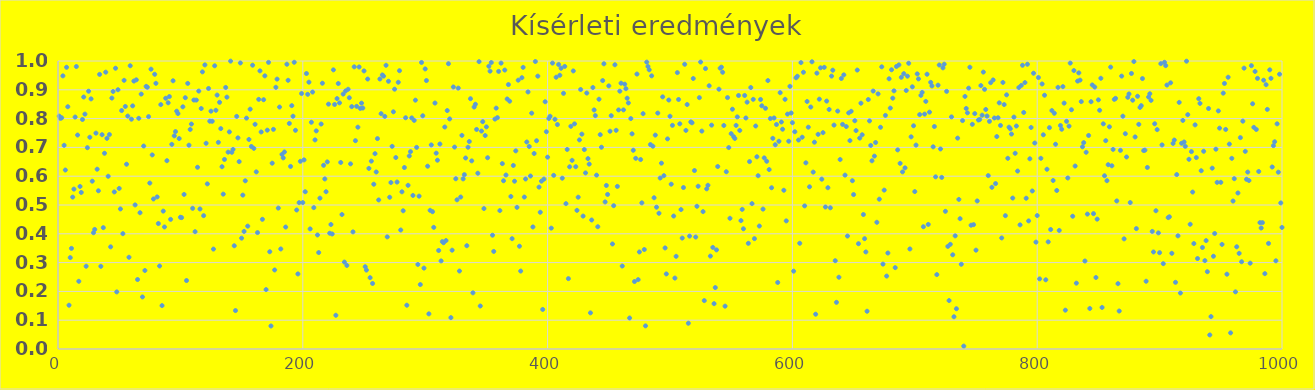
| Category | Series 0 |
|---|---|
| 1.0 | 0.809 |
| 2.0 | 0.801 |
| 3.0 | 0.803 |
| 4.0 | 0.948 |
| 5.0 | 0.707 |
| 6.0 | 0.621 |
| 7.0 | 0.978 |
| 8.0 | 0.841 |
| 9.0 | 0.152 |
| 10.0 | 0.317 |
| 11.0 | 0.349 |
| 12.0 | 0.527 |
| 13.0 | 0.555 |
| 14.0 | 0.805 |
| 15.0 | 0.981 |
| 16.0 | 0.743 |
| 17.0 | 0.235 |
| 18.0 | 0.564 |
| 19.0 | 0.544 |
| 20.0 | 0.797 |
| 21.0 | 0.875 |
| 22.0 | 0.816 |
| 23.0 | 0.287 |
| 24.0 | 0.699 |
| 25.0 | 0.895 |
| 26.0 | 0.735 |
| 27.0 | 0.869 |
| 28.0 | 0.583 |
| 29.0 | 0.404 |
| 30.0 | 0.415 |
| 31.0 | 0.75 |
| 32.0 | 0.624 |
| 33.0 | 0.549 |
| 34.0 | 0.954 |
| 35.0 | 0.287 |
| 36.0 | 0.744 |
| 37.0 | 0.421 |
| 38.0 | 0.68 |
| 39.0 | 0.961 |
| 40.0 | 0.731 |
| 41.0 | 0.6 |
| 42.0 | 0.745 |
| 43.0 | 0.355 |
| 44.0 | 0.871 |
| 45.0 | 0.894 |
| 46.0 | 0.545 |
| 47.0 | 0.975 |
| 48.0 | 0.198 |
| 49.0 | 0.9 |
| 50.0 | 0.558 |
| 51.0 | 0.486 |
| 52.0 | 0.828 |
| 53.0 | 0.4 |
| 54.0 | 0.933 |
| 55.0 | 0.842 |
| 56.0 | 0.642 |
| 57.0 | 0.809 |
| 58.0 | 0.318 |
| 59.0 | 0.983 |
| 60.0 | 0.798 |
| 61.0 | 0.844 |
| 62.0 | 0.93 |
| 63.0 | 0.5 |
| 64.0 | 0.935 |
| 65.0 | 0.241 |
| 66.0 | 0.801 |
| 67.0 | 0.473 |
| 68.0 | 0.885 |
| 69.0 | 0.181 |
| 70.0 | 0.705 |
| 71.0 | 0.273 |
| 72.0 | 0.912 |
| 73.0 | 0.909 |
| 74.0 | 0.807 |
| 75.0 | 0.576 |
| 76.0 | 0.972 |
| 77.0 | 0.674 |
| 78.0 | 0.521 |
| 79.0 | 0.954 |
| 80.0 | 0.923 |
| 81.0 | 0.528 |
| 82.0 | 0.436 |
| 83.0 | 0.288 |
| 84.0 | 0.849 |
| 85.0 | 0.151 |
| 86.0 | 0.479 |
| 87.0 | 0.424 |
| 88.0 | 0.871 |
| 89.0 | 0.654 |
| 90.0 | 0.855 |
| 91.0 | 0.876 |
| 92.0 | 0.45 |
| 93.0 | 0.711 |
| 94.0 | 0.931 |
| 95.0 | 0.74 |
| 96.0 | 0.755 |
| 97.0 | 0.826 |
| 98.0 | 0.817 |
| 99.0 | 0.731 |
| 100.0 | 0.457 |
| 101.0 | 0.456 |
| 102.0 | 0.841 |
| 103.0 | 0.537 |
| 104.0 | 0.873 |
| 105.0 | 0.238 |
| 106.0 | 0.922 |
| 107.0 | 0.708 |
| 108.0 | 0.762 |
| 109.0 | 0.781 |
| 110.0 | 0.488 |
| 111.0 | 0.864 |
| 112.0 | 0.407 |
| 113.0 | 0.864 |
| 114.0 | 0.631 |
| 115.0 | 0.896 |
| 116.0 | 0.486 |
| 117.0 | 0.835 |
| 118.0 | 0.962 |
| 119.0 | 0.463 |
| 120.0 | 0.986 |
| 121.0 | 0.714 |
| 122.0 | 0.573 |
| 123.0 | 0.905 |
| 124.0 | 0.791 |
| 125.0 | 0.826 |
| 126.0 | 0.791 |
| 127.0 | 0.347 |
| 128.0 | 0.983 |
| 129.0 | 0.829 |
| 130.0 | 0.882 |
| 131.0 | 0.718 |
| 132.0 | 0.857 |
| 133.0 | 0.765 |
| 134.0 | 0.633 |
| 135.0 | 0.538 |
| 136.0 | 0.658 |
| 137.0 | 0.908 |
| 138.0 | 0.874 |
| 139.0 | 0.684 |
| 140.0 | 0.754 |
| 141.0 | 1 |
| 142.0 | 0.683 |
| 143.0 | 0.693 |
| 144.0 | 0.358 |
| 145.0 | 0.133 |
| 146.0 | 0.808 |
| 147.0 | 0.733 |
| 148.0 | 0.651 |
| 149.0 | 0.993 |
| 150.0 | 0.385 |
| 151.0 | 0.534 |
| 152.0 | 0.408 |
| 153.0 | 0.584 |
| 154.0 | 0.802 |
| 155.0 | 0.427 |
| 156.0 | 0.728 |
| 157.0 | 0.833 |
| 158.0 | 0.703 |
| 159.0 | 0.985 |
| 160.0 | 0.697 |
| 161.0 | 0.78 |
| 162.0 | 0.615 |
| 163.0 | 0.404 |
| 164.0 | 0.867 |
| 165.0 | 0.966 |
| 166.0 | 0.754 |
| 167.0 | 0.45 |
| 168.0 | 0.866 |
| 169.0 | 0.948 |
| 170.0 | 0.206 |
| 171.0 | 0.76 |
| 172.0 | 0.995 |
| 173.0 | 0.338 |
| 174.0 | 0.08 |
| 175.0 | 0.645 |
| 176.0 | 0.763 |
| 177.0 | 0.274 |
| 178.0 | 0.909 |
| 179.0 | 0.937 |
| 180.0 | 0.489 |
| 181.0 | 0.84 |
| 182.0 | 0.347 |
| 183.0 | 0.676 |
| 184.0 | 0.664 |
| 185.0 | 0.684 |
| 186.0 | 0.423 |
| 187.0 | 0.989 |
| 188.0 | 0.933 |
| 189.0 | 0.783 |
| 190.0 | 0.634 |
| 191.0 | 0.845 |
| 192.0 | 0.808 |
| 193.0 | 0.996 |
| 194.0 | 0.759 |
| 195.0 | 0.483 |
| 196.0 | 0.261 |
| 197.0 | 0.508 |
| 198.0 | 0.652 |
| 199.0 | 0.887 |
| 200.0 | 0.508 |
| 201.0 | 0.657 |
| 202.0 | 0.546 |
| 203.0 | 0.956 |
| 204.0 | 0.884 |
| 205.0 | 0.926 |
| 206.0 | 0.417 |
| 207.0 | 0.787 |
| 208.0 | 0.892 |
| 209.0 | 0.491 |
| 210.0 | 0.726 |
| 211.0 | 0.757 |
| 212.0 | 0.396 |
| 213.0 | 0.335 |
| 214.0 | 0.524 |
| 215.0 | 0.781 |
| 216.0 | 0.923 |
| 217.0 | 0.638 |
| 218.0 | 0.59 |
| 219.0 | 0.546 |
| 220.0 | 0.65 |
| 221.0 | 0.85 |
| 222.0 | 0.402 |
| 223.0 | 0.432 |
| 224.0 | 0.399 |
| 225.0 | 0.969 |
| 226.0 | 0.849 |
| 227.0 | 0.117 |
| 228.0 | 0.87 |
| 229.0 | 0.922 |
| 230.0 | 0.855 |
| 231.0 | 0.648 |
| 232.0 | 0.467 |
| 233.0 | 0.885 |
| 234.0 | 0.302 |
| 235.0 | 0.896 |
| 236.0 | 0.29 |
| 237.0 | 0.902 |
| 238.0 | 0.872 |
| 239.0 | 0.643 |
| 240.0 | 0.842 |
| 241.0 | 0.407 |
| 242.0 | 0.98 |
| 243.0 | 0.723 |
| 244.0 | 0.843 |
| 245.0 | 0.77 |
| 246.0 | 0.979 |
| 247.0 | 0.835 |
| 248.0 | 0.854 |
| 249.0 | 0.837 |
| 250.0 | 0.966 |
| 251.0 | 0.286 |
| 252.0 | 0.274 |
| 253.0 | 0.937 |
| 254.0 | 0.627 |
| 255.0 | 0.248 |
| 256.0 | 0.652 |
| 257.0 | 0.228 |
| 258.0 | 0.572 |
| 259.0 | 0.678 |
| 260.0 | 0.615 |
| 261.0 | 0.731 |
| 262.0 | 0.518 |
| 263.0 | 0.938 |
| 264.0 | 0.817 |
| 265.0 | 0.952 |
| 266.0 | 0.948 |
| 267.0 | 0.808 |
| 268.0 | 0.985 |
| 269.0 | 0.389 |
| 270.0 | 0.93 |
| 271.0 | 0.527 |
| 272.0 | 0.578 |
| 273.0 | 0.704 |
| 274.0 | 0.824 |
| 275.0 | 0.902 |
| 276.0 | 0.665 |
| 277.0 | 0.58 |
| 278.0 | 0.926 |
| 279.0 | 0.966 |
| 280.0 | 0.413 |
| 281.0 | 0.546 |
| 282.0 | 0.48 |
| 283.0 | 0.63 |
| 284.0 | 0.803 |
| 285.0 | 0.152 |
| 286.0 | 0.568 |
| 287.0 | 0.67 |
| 288.0 | 0.685 |
| 289.0 | 0.802 |
| 290.0 | 0.533 |
| 291.0 | 0.794 |
| 292.0 | 0.864 |
| 293.0 | 0.7 |
| 294.0 | 0.294 |
| 295.0 | 0.531 |
| 296.0 | 0.224 |
| 297.0 | 0.995 |
| 298.0 | 0.81 |
| 299.0 | 0.281 |
| 300.0 | 0.973 |
| 301.0 | 0.932 |
| 302.0 | 0.635 |
| 303.0 | 0.122 |
| 304.0 | 0.482 |
| 305.0 | 0.709 |
| 306.0 | 0.477 |
| 307.0 | 0.422 |
| 308.0 | 0.854 |
| 309.0 | 0.68 |
| 310.0 | 0.656 |
| 311.0 | 0.342 |
| 312.0 | 0.712 |
| 313.0 | 0.306 |
| 314.0 | 0.373 |
| 315.0 | 0.369 |
| 316.0 | 0.771 |
| 317.0 | 0.377 |
| 318.0 | 0.828 |
| 319.0 | 0.991 |
| 320.0 | 0.799 |
| 321.0 | 0.109 |
| 322.0 | 0.343 |
| 323.0 | 0.91 |
| 324.0 | 0.701 |
| 325.0 | 0.591 |
| 326.0 | 0.518 |
| 327.0 | 0.906 |
| 328.0 | 0.271 |
| 329.0 | 0.528 |
| 330.0 | 0.742 |
| 331.0 | 0.591 |
| 332.0 | 0.605 |
| 333.0 | 0.663 |
| 334.0 | 0.359 |
| 335.0 | 0.701 |
| 336.0 | 0.72 |
| 337.0 | 0.869 |
| 338.0 | 0.653 |
| 339.0 | 0.195 |
| 340.0 | 0.84 |
| 341.0 | 0.85 |
| 342.0 | 0.762 |
| 343.0 | 0.61 |
| 344.0 | 0.998 |
| 345.0 | 0.149 |
| 346.0 | 0.757 |
| 347.0 | 0.789 |
| 348.0 | 0.488 |
| 349.0 | 0.741 |
| 350.0 | 0.771 |
| 351.0 | 0.664 |
| 352.0 | 0.982 |
| 353.0 | 0.965 |
| 354.0 | 0.995 |
| 355.0 | 0.395 |
| 356.0 | 0.339 |
| 357.0 | 0.798 |
| 358.0 | 0.836 |
| 359.0 | 0.803 |
| 360.0 | 0.964 |
| 361.0 | 0.481 |
| 362.0 | 0.993 |
| 363.0 | 0.644 |
| 364.0 | 0.584 |
| 365.0 | 0.969 |
| 366.0 | 0.604 |
| 367.0 | 0.868 |
| 368.0 | 0.918 |
| 369.0 | 0.86 |
| 370.0 | 0.53 |
| 371.0 | 0.383 |
| 372.0 | 0.637 |
| 373.0 | 0.583 |
| 374.0 | 0.688 |
| 375.0 | 0.492 |
| 376.0 | 0.933 |
| 377.0 | 0.357 |
| 378.0 | 0.271 |
| 379.0 | 0.942 |
| 380.0 | 0.978 |
| 381.0 | 0.528 |
| 382.0 | 0.59 |
| 383.0 | 0.719 |
| 384.0 | 0.893 |
| 385.0 | 0.703 |
| 386.0 | 0.601 |
| 387.0 | 0.819 |
| 388.0 | 0.424 |
| 389.0 | 0.679 |
| 390.0 | 0.998 |
| 391.0 | 0.723 |
| 392.0 | 0.947 |
| 393.0 | 0.562 |
| 394.0 | 0.475 |
| 395.0 | 0.583 |
| 396.0 | 0.137 |
| 397.0 | 0.59 |
| 398.0 | 0.859 |
| 399.0 | 0.754 |
| 400.0 | 0.666 |
| 401.0 | 0.8 |
| 402.0 | 0.808 |
| 403.0 | 0.42 |
| 404.0 | 0.993 |
| 405.0 | 0.603 |
| 406.0 | 0.798 |
| 407.0 | 0.944 |
| 408.0 | 0.779 |
| 409.0 | 0.988 |
| 410.0 | 0.95 |
| 411.0 | 0.975 |
| 412.0 | 0.593 |
| 413.0 | 0.888 |
| 414.0 | 0.981 |
| 415.0 | 0.505 |
| 416.0 | 0.693 |
| 417.0 | 0.244 |
| 418.0 | 0.633 |
| 419.0 | 0.773 |
| 420.0 | 0.655 |
| 421.0 | 0.966 |
| 422.0 | 0.782 |
| 423.0 | 0.633 |
| 424.0 | 0.481 |
| 425.0 | 0.527 |
| 426.0 | 0.726 |
| 427.0 | 0.901 |
| 428.0 | 0.746 |
| 429.0 | 0.461 |
| 430.0 | 0.692 |
| 431.0 | 0.611 |
| 432.0 | 0.889 |
| 433.0 | 0.661 |
| 434.0 | 0.642 |
| 435.0 | 0.125 |
| 436.0 | 0.448 |
| 437.0 | 0.908 |
| 438.0 | 0.83 |
| 439.0 | 0.81 |
| 440.0 | 0.604 |
| 441.0 | 0.425 |
| 442.0 | 0.867 |
| 443.0 | 0.744 |
| 444.0 | 0.701 |
| 445.0 | 0.932 |
| 446.0 | 0.99 |
| 447.0 | 0.511 |
| 448.0 | 0.568 |
| 449.0 | 0.537 |
| 450.0 | 0.914 |
| 451.0 | 0.756 |
| 452.0 | 0.81 |
| 453.0 | 0.365 |
| 454.0 | 0.498 |
| 455.0 | 0.987 |
| 456.0 | 0.759 |
| 457.0 | 0.565 |
| 458.0 | 0.83 |
| 459.0 | 0.895 |
| 460.0 | 0.923 |
| 461.0 | 0.288 |
| 462.0 | 0.83 |
| 463.0 | 0.92 |
| 464.0 | 0.904 |
| 465.0 | 0.871 |
| 466.0 | 0.854 |
| 467.0 | 0.108 |
| 468.0 | 0.8 |
| 469.0 | 0.747 |
| 470.0 | 0.69 |
| 471.0 | 0.234 |
| 472.0 | 0.662 |
| 473.0 | 0.955 |
| 474.0 | 0.241 |
| 475.0 | 0.337 |
| 476.0 | 0.658 |
| 477.0 | 0.507 |
| 478.0 | 0.817 |
| 479.0 | 0.345 |
| 480.0 | 0.08 |
| 481.0 | 0.996 |
| 482.0 | 0.981 |
| 483.0 | 0.969 |
| 484.0 | 0.71 |
| 485.0 | 0.948 |
| 486.0 | 0.704 |
| 487.0 | 0.525 |
| 488.0 | 0.743 |
| 489.0 | 0.492 |
| 490.0 | 0.819 |
| 491.0 | 0.471 |
| 492.0 | 0.594 |
| 493.0 | 0.645 |
| 494.0 | 0.876 |
| 495.0 | 0.602 |
| 496.0 | 0.351 |
| 497.0 | 0.261 |
| 498.0 | 0.73 |
| 499.0 | 0.864 |
| 500.0 | 0.808 |
| 501.0 | 0.572 |
| 502.0 | 0.777 |
| 503.0 | 0.462 |
| 504.0 | 0.246 |
| 505.0 | 0.322 |
| 506.0 | 0.96 |
| 507.0 | 0.866 |
| 508.0 | 0.782 |
| 509.0 | 0.484 |
| 510.0 | 0.385 |
| 511.0 | 0.561 |
| 512.0 | 0.989 |
| 513.0 | 0.759 |
| 514.0 | 0.849 |
| 515.0 | 0.089 |
| 516.0 | 0.392 |
| 517.0 | 0.788 |
| 518.0 | 0.786 |
| 519.0 | 0.939 |
| 520.0 | 0.62 |
| 521.0 | 0.389 |
| 522.0 | 0.496 |
| 523.0 | 0.565 |
| 524.0 | 0.873 |
| 525.0 | 0.996 |
| 526.0 | 0.757 |
| 527.0 | 0.477 |
| 528.0 | 0.168 |
| 529.0 | 0.974 |
| 530.0 | 0.556 |
| 531.0 | 0.568 |
| 532.0 | 0.914 |
| 533.0 | 0.323 |
| 534.0 | 0.777 |
| 535.0 | 0.353 |
| 536.0 | 0.157 |
| 537.0 | 0.213 |
| 538.0 | 0.344 |
| 539.0 | 0.634 |
| 540.0 | 0.902 |
| 541.0 | 0.975 |
| 542.0 | 0.979 |
| 543.0 | 0.961 |
| 544.0 | 0.776 |
| 545.0 | 0.149 |
| 546.0 | 0.616 |
| 547.0 | 0.873 |
| 548.0 | 0.699 |
| 549.0 | 0.454 |
| 550.0 | 0.748 |
| 551.0 | 0.833 |
| 552.0 | 0.737 |
| 553.0 | 0.731 |
| 554.0 | 0.776 |
| 555.0 | 0.806 |
| 556.0 | 0.88 |
| 557.0 | 0.759 |
| 558.0 | 0.446 |
| 559.0 | 0.485 |
| 560.0 | 0.417 |
| 561.0 | 0.88 |
| 562.0 | 0.802 |
| 563.0 | 0.857 |
| 564.0 | 0.367 |
| 565.0 | 0.651 |
| 566.0 | 0.908 |
| 567.0 | 0.505 |
| 568.0 | 0.867 |
| 569.0 | 0.383 |
| 570.0 | 0.774 |
| 571.0 | 0.667 |
| 572.0 | 0.602 |
| 573.0 | 0.427 |
| 574.0 | 0.866 |
| 575.0 | 0.844 |
| 576.0 | 0.486 |
| 577.0 | 0.664 |
| 578.0 | 0.836 |
| 579.0 | 0.652 |
| 580.0 | 0.932 |
| 581.0 | 0.623 |
| 582.0 | 0.8 |
| 583.0 | 0.56 |
| 584.0 | 0.731 |
| 585.0 | 0.802 |
| 586.0 | 0.709 |
| 587.0 | 0.78 |
| 588.0 | 0.231 |
| 589.0 | 0.721 |
| 590.0 | 0.89 |
| 591.0 | 0.788 |
| 592.0 | 0.763 |
| 593.0 | 0.551 |
| 594.0 | 0.867 |
| 595.0 | 0.445 |
| 596.0 | 0.816 |
| 597.0 | 0.721 |
| 598.0 | 0.912 |
| 599.0 | 0.819 |
| 600.0 | 0.786 |
| 601.0 | 0.27 |
| 602.0 | 0.754 |
| 603.0 | 0.942 |
| 604.0 | 0.947 |
| 605.0 | 0.726 |
| 606.0 | 0.367 |
| 607.0 | 0.994 |
| 608.0 | 0.735 |
| 609.0 | 0.961 |
| 610.0 | 0.497 |
| 611.0 | 0.646 |
| 612.0 | 0.859 |
| 613.0 | 0.77 |
| 614.0 | 0.563 |
| 615.0 | 0.84 |
| 616.0 | 0.997 |
| 617.0 | 0.614 |
| 618.0 | 0.718 |
| 619.0 | 0.121 |
| 620.0 | 0.958 |
| 621.0 | 0.745 |
| 622.0 | 0.867 |
| 623.0 | 0.976 |
| 624.0 | 0.59 |
| 625.0 | 0.751 |
| 626.0 | 0.978 |
| 627.0 | 0.493 |
| 628.0 | 0.861 |
| 629.0 | 0.56 |
| 630.0 | 0.832 |
| 631.0 | 0.49 |
| 632.0 | 0.948 |
| 633.0 | 0.968 |
| 634.0 | 0.777 |
| 635.0 | 0.307 |
| 636.0 | 0.162 |
| 637.0 | 0.826 |
| 638.0 | 0.249 |
| 639.0 | 0.658 |
| 640.0 | 0.939 |
| 641.0 | 0.78 |
| 642.0 | 0.952 |
| 643.0 | 0.604 |
| 644.0 | 0.772 |
| 645.0 | 0.392 |
| 646.0 | 0.82 |
| 647.0 | 0.724 |
| 648.0 | 0.825 |
| 649.0 | 0.584 |
| 650.0 | 0.536 |
| 651.0 | 0.793 |
| 652.0 | 0.758 |
| 653.0 | 0.969 |
| 654.0 | 0.366 |
| 655.0 | 0.732 |
| 656.0 | 0.853 |
| 657.0 | 0.744 |
| 658.0 | 0.467 |
| 659.0 | 0.383 |
| 660.0 | 0.337 |
| 661.0 | 0.131 |
| 662.0 | 0.866 |
| 663.0 | 0.792 |
| 664.0 | 0.707 |
| 665.0 | 0.654 |
| 666.0 | 0.896 |
| 667.0 | 0.67 |
| 668.0 | 0.717 |
| 669.0 | 0.44 |
| 670.0 | 0.886 |
| 671.0 | 0.52 |
| 672.0 | 0.77 |
| 673.0 | 0.98 |
| 674.0 | 0.295 |
| 675.0 | 0.552 |
| 676.0 | 0.811 |
| 677.0 | 0.253 |
| 678.0 | 0.333 |
| 679.0 | 0.938 |
| 680.0 | 0.837 |
| 681.0 | 0.969 |
| 682.0 | 0.871 |
| 683.0 | 0.896 |
| 684.0 | 0.282 |
| 685.0 | 0.981 |
| 686.0 | 0.691 |
| 687.0 | 0.987 |
| 688.0 | 0.645 |
| 689.0 | 0.943 |
| 690.0 | 0.615 |
| 691.0 | 0.956 |
| 692.0 | 0.629 |
| 693.0 | 0.898 |
| 694.0 | 0.947 |
| 695.0 | 0.992 |
| 696.0 | 0.347 |
| 697.0 | 0.737 |
| 698.0 | 0.91 |
| 699.0 | 0.775 |
| 700.0 | 0.547 |
| 701.0 | 0.708 |
| 702.0 | 0.955 |
| 703.0 | 0.938 |
| 704.0 | 0.814 |
| 705.0 | 0.881 |
| 706.0 | 0.891 |
| 707.0 | 0.425 |
| 708.0 | 0.816 |
| 709.0 | 0.86 |
| 710.0 | 0.954 |
| 711.0 | 0.433 |
| 712.0 | 0.822 |
| 713.0 | 0.926 |
| 714.0 | 0.913 |
| 715.0 | 0.702 |
| 716.0 | 0.772 |
| 717.0 | 0.598 |
| 718.0 | 0.258 |
| 719.0 | 0.916 |
| 720.0 | 0.986 |
| 721.0 | 0.695 |
| 722.0 | 0.596 |
| 723.0 | 0.976 |
| 724.0 | 0.989 |
| 725.0 | 0.478 |
| 726.0 | 0.895 |
| 727.0 | 0.356 |
| 728.0 | 0.168 |
| 729.0 | 0.363 |
| 730.0 | 0.806 |
| 731.0 | 0.327 |
| 732.0 | 0.112 |
| 733.0 | 0.393 |
| 734.0 | 0.14 |
| 735.0 | 0.732 |
| 736.0 | 0.519 |
| 737.0 | 0.453 |
| 738.0 | 0.294 |
| 739.0 | 0.793 |
| 740.0 | 0.01 |
| 741.0 | 0.877 |
| 742.0 | 0.835 |
| 743.0 | 0.82 |
| 744.0 | 0.906 |
| 745.0 | 0.978 |
| 746.0 | 0.43 |
| 747.0 | 0.78 |
| 748.0 | 0.432 |
| 749.0 | 0.817 |
| 750.0 | 0.343 |
| 751.0 | 0.514 |
| 752.0 | 0.795 |
| 753.0 | 0.797 |
| 754.0 | 0.915 |
| 755.0 | 0.812 |
| 756.0 | 0.962 |
| 757.0 | 0.902 |
| 758.0 | 0.832 |
| 759.0 | 0.809 |
| 760.0 | 0.602 |
| 761.0 | 0.79 |
| 762.0 | 0.925 |
| 763.0 | 0.561 |
| 764.0 | 0.934 |
| 765.0 | 0.802 |
| 766.0 | 0.574 |
| 767.0 | 0.738 |
| 768.0 | 0.803 |
| 769.0 | 0.855 |
| 770.0 | 0.776 |
| 771.0 | 0.386 |
| 772.0 | 0.925 |
| 773.0 | 0.849 |
| 774.0 | 0.463 |
| 775.0 | 0.882 |
| 776.0 | 0.662 |
| 777.0 | 0.77 |
| 778.0 | 0.765 |
| 779.0 | 0.746 |
| 780.0 | 0.524 |
| 781.0 | 0.805 |
| 782.0 | 0.68 |
| 783.0 | 0.774 |
| 784.0 | 0.618 |
| 785.0 | 0.908 |
| 786.0 | 0.431 |
| 787.0 | 0.915 |
| 788.0 | 0.985 |
| 789.0 | 0.821 |
| 790.0 | 0.925 |
| 791.0 | 0.523 |
| 792.0 | 0.989 |
| 793.0 | 0.445 |
| 794.0 | 0.66 |
| 795.0 | 0.769 |
| 796.0 | 0.549 |
| 797.0 | 0.958 |
| 798.0 | 0.715 |
| 799.0 | 0.371 |
| 800.0 | 0.463 |
| 801.0 | 0.943 |
| 802.0 | 0.243 |
| 803.0 | 0.662 |
| 804.0 | 0.92 |
| 805.0 | 0.744 |
| 806.0 | 0.881 |
| 807.0 | 0.24 |
| 808.0 | 0.624 |
| 809.0 | 0.372 |
| 810.0 | 0.769 |
| 811.0 | 0.415 |
| 812.0 | 0.828 |
| 813.0 | 0.585 |
| 814.0 | 0.818 |
| 815.0 | 0.711 |
| 816.0 | 0.55 |
| 817.0 | 0.909 |
| 818.0 | 0.412 |
| 819.0 | 0.776 |
| 820.0 | 0.763 |
| 821.0 | 0.911 |
| 822.0 | 0.854 |
| 823.0 | 0.135 |
| 824.0 | 0.79 |
| 825.0 | 0.594 |
| 826.0 | 0.774 |
| 827.0 | 0.993 |
| 828.0 | 0.831 |
| 829.0 | 0.461 |
| 830.0 | 0.967 |
| 831.0 | 0.635 |
| 832.0 | 0.229 |
| 833.0 | 0.93 |
| 834.0 | 0.959 |
| 835.0 | 0.934 |
| 836.0 | 0.859 |
| 837.0 | 0.702 |
| 838.0 | 0.717 |
| 839.0 | 0.306 |
| 840.0 | 0.683 |
| 841.0 | 0.468 |
| 842.0 | 0.741 |
| 843.0 | 0.141 |
| 844.0 | 0.859 |
| 845.0 | 0.917 |
| 846.0 | 0.47 |
| 847.0 | 0.91 |
| 848.0 | 0.248 |
| 849.0 | 0.451 |
| 850.0 | 0.865 |
| 851.0 | 0.829 |
| 852.0 | 0.94 |
| 853.0 | 0.144 |
| 854.0 | 0.782 |
| 855.0 | 0.602 |
| 856.0 | 0.723 |
| 857.0 | 0.584 |
| 858.0 | 0.64 |
| 859.0 | 0.771 |
| 860.0 | 0.979 |
| 861.0 | 0.636 |
| 862.0 | 0.693 |
| 863.0 | 0.867 |
| 864.0 | 0.87 |
| 865.0 | 0.514 |
| 866.0 | 0.227 |
| 867.0 | 0.132 |
| 868.0 | 0.69 |
| 869.0 | 0.948 |
| 870.0 | 0.808 |
| 871.0 | 0.382 |
| 872.0 | 0.747 |
| 873.0 | 0.667 |
| 874.0 | 0.874 |
| 875.0 | 0.885 |
| 876.0 | 0.509 |
| 877.0 | 0.957 |
| 878.0 | 0.864 |
| 879.0 | 0.998 |
| 880.0 | 0.736 |
| 881.0 | 0.418 |
| 882.0 | 0.878 |
| 883.0 | 0.78 |
| 884.0 | 0.839 |
| 885.0 | 0.845 |
| 886.0 | 0.939 |
| 887.0 | 0.689 |
| 888.0 | 0.69 |
| 889.0 | 0.235 |
| 890.0 | 0.63 |
| 891.0 | 0.875 |
| 892.0 | 0.886 |
| 893.0 | 0.863 |
| 894.0 | 0.408 |
| 895.0 | 0.337 |
| 896.0 | 0.782 |
| 897.0 | 0.48 |
| 898.0 | 0.762 |
| 899.0 | 0.403 |
| 900.0 | 0.334 |
| 901.0 | 0.991 |
| 902.0 | 0.709 |
| 903.0 | 0.296 |
| 904.0 | 0.996 |
| 905.0 | 0.984 |
| 906.0 | 0.916 |
| 907.0 | 0.456 |
| 908.0 | 0.459 |
| 909.0 | 0.924 |
| 910.0 | 0.332 |
| 911.0 | 0.714 |
| 912.0 | 0.726 |
| 913.0 | 0.232 |
| 914.0 | 0.606 |
| 915.0 | 0.393 |
| 916.0 | 0.856 |
| 917.0 | 0.194 |
| 918.0 | 0.714 |
| 919.0 | 0.794 |
| 920.0 | 0.719 |
| 921.0 | 0.704 |
| 922.0 | 0.999 |
| 923.0 | 0.814 |
| 924.0 | 0.659 |
| 925.0 | 0.433 |
| 926.0 | 0.685 |
| 927.0 | 0.545 |
| 928.0 | 0.366 |
| 929.0 | 0.778 |
| 930.0 | 0.665 |
| 931.0 | 0.314 |
| 932.0 | 0.869 |
| 933.0 | 0.853 |
| 934.0 | 0.619 |
| 935.0 | 0.352 |
| 936.0 | 0.687 |
| 937.0 | 0.307 |
| 938.0 | 0.376 |
| 939.0 | 0.268 |
| 940.0 | 0.835 |
| 941.0 | 0.049 |
| 942.0 | 0.113 |
| 943.0 | 0.628 |
| 944.0 | 0.322 |
| 945.0 | 0.401 |
| 946.0 | 0.694 |
| 947.0 | 0.579 |
| 948.0 | 0.827 |
| 949.0 | 0.767 |
| 950.0 | 0.579 |
| 951.0 | 0.363 |
| 952.0 | 0.888 |
| 953.0 | 0.922 |
| 954.0 | 0.762 |
| 955.0 | 0.26 |
| 956.0 | 0.944 |
| 957.0 | 0.712 |
| 958.0 | 0.056 |
| 959.0 | 0.662 |
| 960.0 | 0.514 |
| 961.0 | 0.591 |
| 962.0 | 0.198 |
| 963.0 | 0.355 |
| 964.0 | 0.542 |
| 965.0 | 0.332 |
| 966.0 | 0.734 |
| 967.0 | 0.303 |
| 968.0 | 0.791 |
| 969.0 | 0.975 |
| 970.0 | 0.686 |
| 971.0 | 0.589 |
| 972.0 | 0.614 |
| 973.0 | 0.585 |
| 974.0 | 0.298 |
| 975.0 | 0.984 |
| 976.0 | 0.851 |
| 977.0 | 0.77 |
| 978.0 | 0.964 |
| 979.0 | 0.762 |
| 980.0 | 0.94 |
| 981.0 | 0.616 |
| 982.0 | 0.439 |
| 983.0 | 0.42 |
| 984.0 | 0.439 |
| 985.0 | 0.933 |
| 986.0 | 0.262 |
| 987.0 | 0.918 |
| 988.0 | 0.832 |
| 989.0 | 0.367 |
| 990.0 | 0.969 |
| 991.0 | 0.94 |
| 992.0 | 0.632 |
| 993.0 | 0.706 |
| 994.0 | 0.72 |
| 995.0 | 0.306 |
| 996.0 | 0.782 |
| 997.0 | 0.614 |
| 998.0 | 0.954 |
| 999.0 | 0.507 |
| 1000.0 | 0.422 |